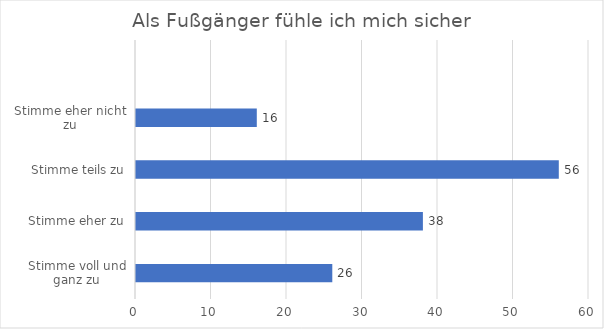
| Category | Series 0 |
|---|---|
| Stimme voll und ganz zu | 26 |
| Stimme eher zu | 38 |
| Stimme teils zu | 56 |
| Stimme eher nicht zu | 16 |